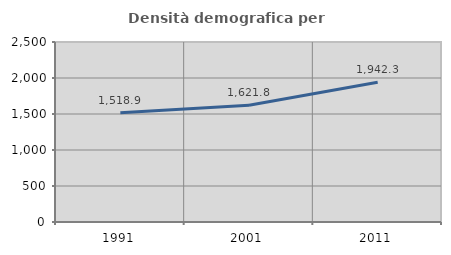
| Category | Densità demografica |
|---|---|
| 1991.0 | 1518.852 |
| 2001.0 | 1621.811 |
| 2011.0 | 1942.343 |